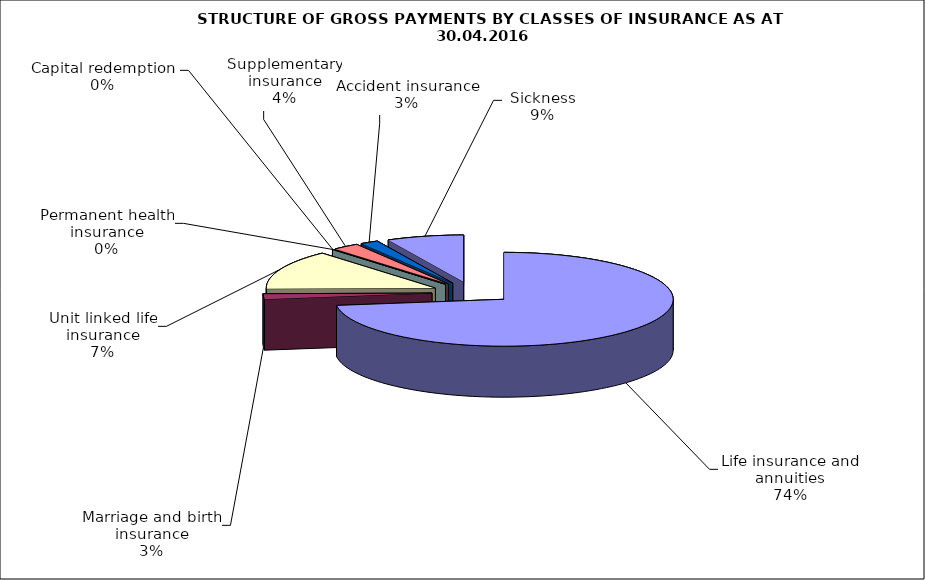
| Category | Series 0 |
|---|---|
| Life insurance and annuities | 39262604.197 |
| Marriage and birth insurance | 1000813.304 |
| Unit linked life insurance | 7303767.026 |
| Permanent health insurance | 17857.12 |
| Capital redemption | 0 |
| Supplementary insurance | 1362108.616 |
| Accident insurance | 936133.39 |
| Sickness | 3966607.23 |